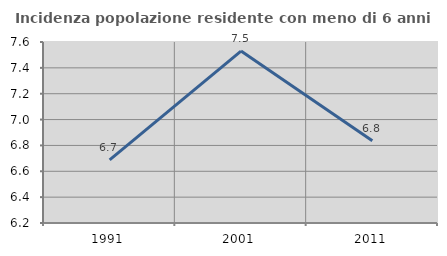
| Category | Incidenza popolazione residente con meno di 6 anni |
|---|---|
| 1991.0 | 6.689 |
| 2001.0 | 7.53 |
| 2011.0 | 6.836 |